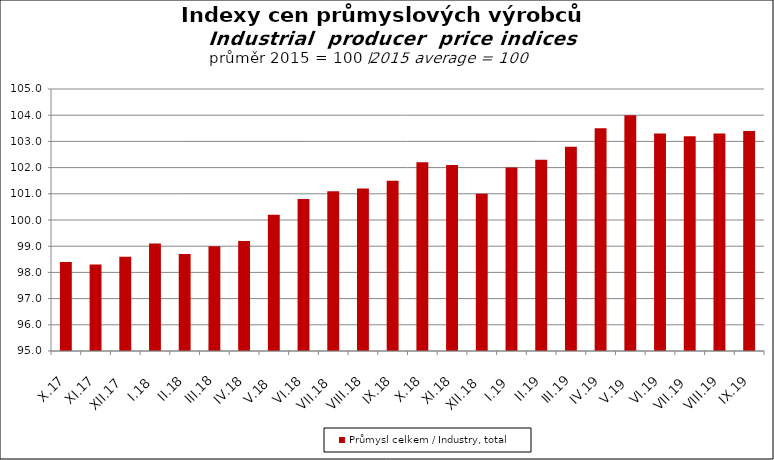
| Category | Průmysl celkem / Industry, total |
|---|---|
| X.17 | 98.4 |
| XI.17 | 98.3 |
| XII.17 | 98.6 |
| I.18 | 99.1 |
| II.18 | 98.7 |
| III.18 | 99 |
| IV.18 | 99.2 |
| V.18 | 100.2 |
| VI.18 | 100.8 |
| VII.18 | 101.1 |
| VIII.18 | 101.2 |
| IX.18 | 101.5 |
| X.18 | 102.2 |
| XI.18 | 102.1 |
| XII.18 | 101 |
| I.19 | 102 |
| II.19 | 102.3 |
| III.19 | 102.8 |
| IV.19 | 103.5 |
| V.19 | 104 |
| VI.19 | 103.3 |
| VII.19 | 103.2 |
| VIII.19 | 103.3 |
| IX.19 | 103.4 |